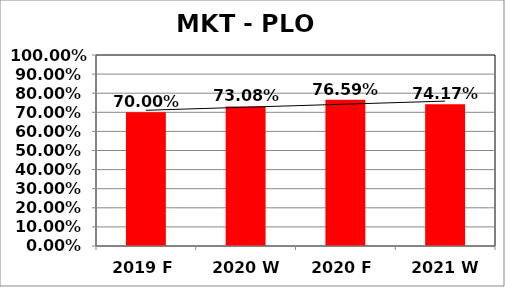
| Category | Series 0 |
|---|---|
| 2019 F | 0.7 |
| 2020 W | 0.731 |
| 2020 F | 0.766 |
| 2021 W | 0.742 |